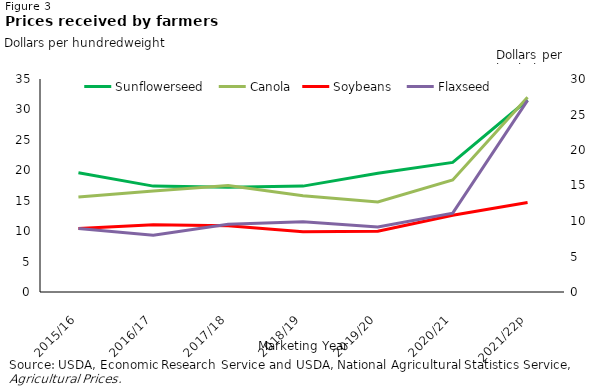
| Category | Sunflowerseed  | Canola |
|---|---|---|
| 2015/16 | 19.6 | 15.6 |
| 2016/17 | 17.4 | 16.6 |
| 2017/18 | 17.2 | 17.5 |
| 2018/19 | 17.4 | 15.8 |
| 2019/20 | 19.5 | 14.8 |
| 2020/21 | 21.3 | 18.4 |
| 2021/22p | 31.55 | 32 |